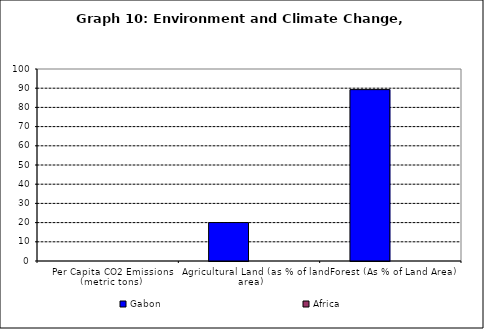
| Category | Gabon | Africa |
|---|---|---|
| Per Capita CO2 Emissions (metric tons) | 0 | 0 |
| Agricultural Land (as % of land area) | 20.026 | 0 |
| Forest (As % of Land Area) | 89.261 | 0 |